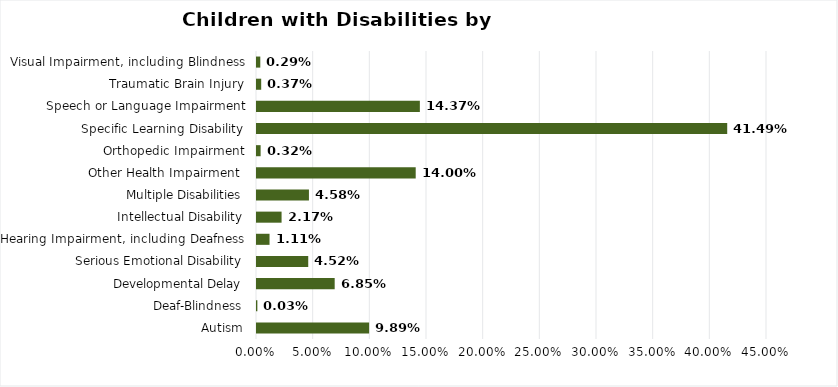
| Category | Series 0 |
|---|---|
| Autism | 0.099 |
| Deaf-Blindness | 0 |
| Developmental Delay | 0.069 |
| Serious Emotional Disability | 0.045 |
| Hearing Impairment, including Deafness | 0.011 |
| Intellectual Disability | 0.022 |
| Multiple Disabilities | 0.046 |
| Other Health Impairment  | 0.14 |
| Orthopedic Impairment | 0.003 |
| Specific Learning Disability | 0.415 |
| Speech or Language Impairment | 0.144 |
| Traumatic Brain Injury | 0.004 |
| Visual Impairment, including Blindness | 0.003 |